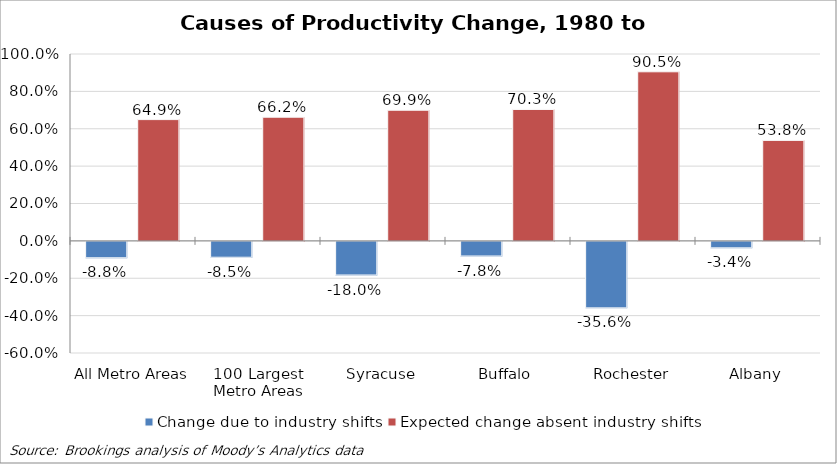
| Category | Change due to industry shifts | Expected change absent industry shifts |
|---|---|---|
| All Metro Areas | -0.088 | 0.649 |
| 100 Largest Metro Areas | -0.085 | 0.662 |
| Syracuse | -0.18 | 0.699 |
| Buffalo | -0.078 | 0.703 |
| Rochester | -0.356 | 0.905 |
| Albany | -0.034 | 0.538 |